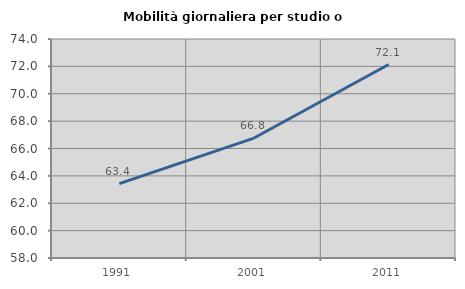
| Category | Mobilità giornaliera per studio o lavoro |
|---|---|
| 1991.0 | 63.437 |
| 2001.0 | 66.764 |
| 2011.0 | 72.133 |